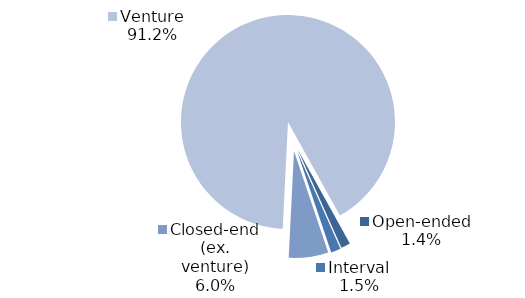
| Category | Series 0 |
|---|---|
| Open-ended | 19 |
| Interval | 20 |
| Closed-end (ex. venture) | 81 |
| Venture | 1237 |